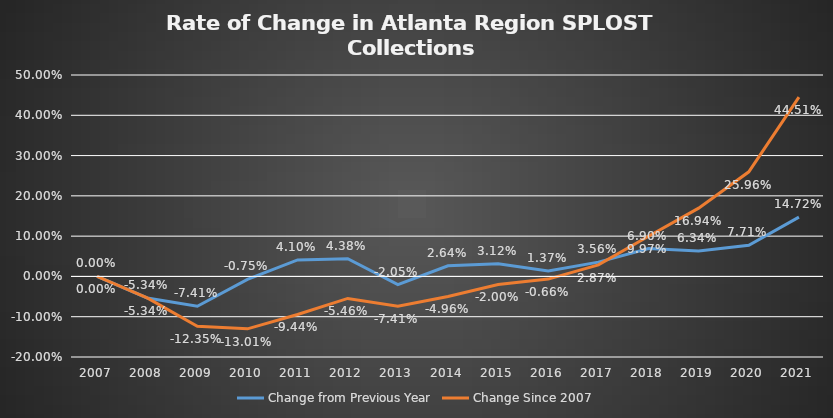
| Category | Change from Previous Year | Change Since 2007 |
|---|---|---|
| 2007.0 | 0 | 0 |
| 2008.0 | -0.053 | -0.053 |
| 2009.0 | -0.074 | -0.124 |
| 2010.0 | -0.007 | -0.13 |
| 2011.0 | 0.041 | -0.094 |
| 2012.0 | 0.044 | -0.055 |
| 2013.0 | -0.021 | -0.074 |
| 2014.0 | 0.026 | -0.05 |
| 2015.0 | 0.031 | -0.02 |
| 2016.0 | 0.014 | -0.007 |
| 2017.0 | 0.036 | 0.029 |
| 2018.0 | 0.069 | 0.1 |
| 2019.0 | 0.063 | 0.169 |
| 2020.0 | 0.077 | 0.26 |
| 2021.0 | 0.147 | 0.445 |